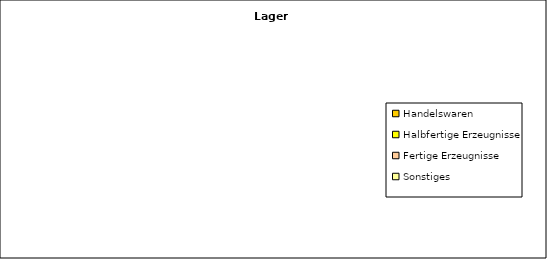
| Category | Series 0 |
|---|---|
| Handelswaren | 0 |
| Halbfertige Erzeugnisse | 0 |
| Fertige Erzeugnisse | 0 |
| Sonstiges | 0 |